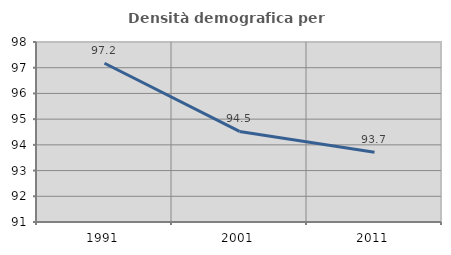
| Category | Densità demografica |
|---|---|
| 1991.0 | 97.174 |
| 2001.0 | 94.522 |
| 2011.0 | 93.715 |